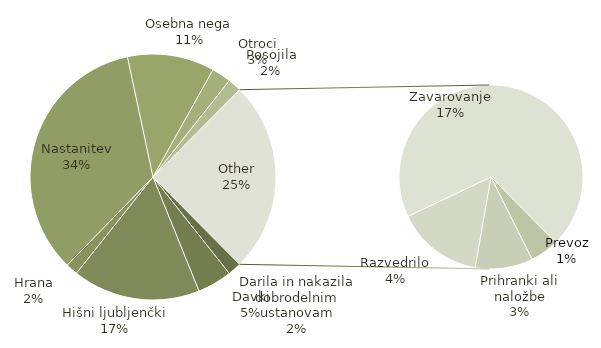
| Category | Vsota |
|---|---|
| Darila in nakazila dobrodelnim ustanovam | 140 |
| Davki | 358 |
| Hišni ljubljenčki | 1320 |
| Hrana | 125 |
| Nastanitev | 2702 |
| Osebna nega | 900 |
| Otroci | 200 |
| Posojila | 140 |
| Prevoz | 100 |
| Prihranki ali naložbe | 200 |
| Razvedrilo | 300 |
| Zavarovanje | 1375 |